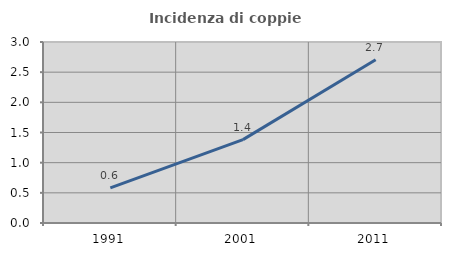
| Category | Incidenza di coppie miste |
|---|---|
| 1991.0 | 0.582 |
| 2001.0 | 1.382 |
| 2011.0 | 2.704 |